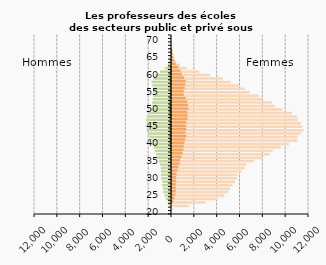
| Category | Femmes public | Femmes privé |
|---|---|---|
| 20.0 | 0 | 0 |
| 21.0 | 64 | 0 |
| 22.0 | 1454 | 8 |
| 23.0 | 2925 | 117 |
| 24.0 | 3964 | 219 |
| 25.0 | 4556 | 307 |
| 26.0 | 4928 | 327 |
| 27.0 | 5069 | 322 |
| 28.0 | 5291 | 332 |
| 29.0 | 5511 | 355 |
| 30.0 | 5678 | 368 |
| 31.0 | 5741 | 400 |
| 32.0 | 6096 | 471 |
| 33.0 | 6369 | 548 |
| 34.0 | 6542 | 667 |
| 35.0 | 7166 | 712 |
| 36.0 | 7873 | 824 |
| 37.0 | 8563 | 915 |
| 38.0 | 8819 | 995 |
| 39.0 | 9503 | 1041 |
| 40.0 | 10242 | 1093 |
| 41.0 | 11002 | 1172 |
| 42.0 | 11008 | 1260 |
| 43.0 | 11299 | 1171 |
| 44.0 | 11516 | 1251 |
| 45.0 | 11414 | 1237 |
| 46.0 | 11276 | 1257 |
| 47.0 | 11027 | 1338 |
| 48.0 | 10931 | 1354 |
| 49.0 | 10490 | 1322 |
| 50.0 | 9656 | 1437 |
| 51.0 | 8988 | 1394 |
| 52.0 | 8742 | 1316 |
| 53.0 | 7930 | 1212 |
| 54.0 | 7593 | 1038 |
| 55.0 | 6832 | 1025 |
| 56.0 | 6355 | 1120 |
| 57.0 | 5870 | 1160 |
| 58.0 | 5120 | 1205 |
| 59.0 | 4452 | 1052 |
| 60.0 | 3332 | 860 |
| 61.0 | 2395 | 744 |
| 62.0 | 1278 | 562 |
| 63.0 | 718 | 320 |
| 64.0 | 378 | 174 |
| 65.0 | 211 | 102 |
| 66.0 | 114 | 48 |
| 67.0 | 27 | 34 |
| 68.0 | 6 | 3 |
| 69.0 | 0 | 1 |
| 70.0 | 0 | 0 |